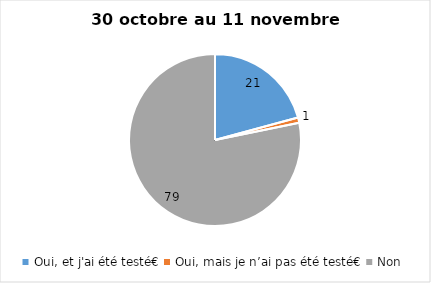
| Category | Series 0 |
|---|---|
| Oui, et j'ai été testé€ | 21 |
| Oui, mais je n’ai pas été testé€ | 1 |
| Non | 79 |